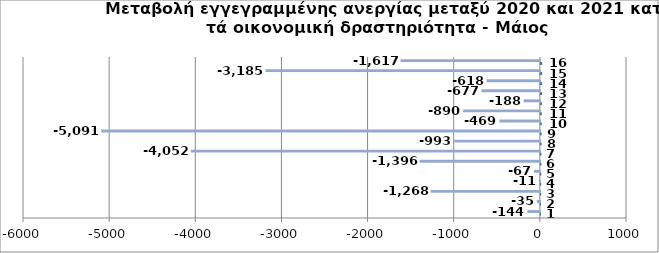
| Category | Series 0 | Series 1 |
|---|---|---|
| 0 | 1 | -144 |
| 1 | 2 | -35 |
| 2 | 3 | -1268 |
| 3 | 4 | -11 |
| 4 | 5 | -67 |
| 5 | 6 | -1396 |
| 6 | 7 | -4052 |
| 7 | 8 | -993 |
| 8 | 9 | -5091 |
| 9 | 10 | -469 |
| 10 | 11 | -890 |
| 11 | 12 | -188 |
| 12 | 13 | -677 |
| 13 | 14 | -618 |
| 14 | 15 | -3185 |
| 15 | 16 | -1617 |